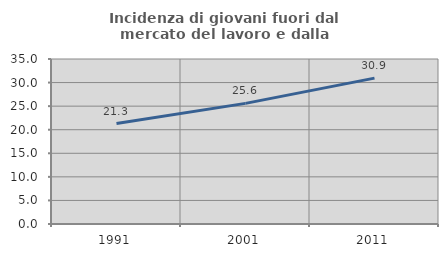
| Category | Incidenza di giovani fuori dal mercato del lavoro e dalla formazione  |
|---|---|
| 1991.0 | 21.298 |
| 2001.0 | 25.587 |
| 2011.0 | 30.943 |